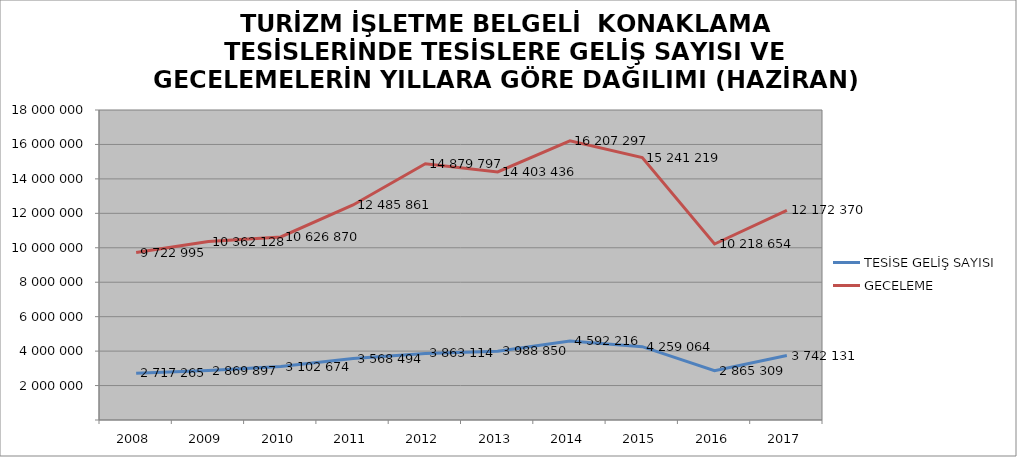
| Category | TESİSE GELİŞ SAYISI | GECELEME |
|---|---|---|
| 2008 | 2717265 | 9722995 |
| 2009 | 2869897 | 10362128 |
| 2010 | 3102674 | 10626870 |
| 2011 | 3568494 | 12485861 |
| 2012 | 3863114 | 14879797 |
| 2013 | 3988850 | 14403436 |
| 2014 | 4592216 | 16207297 |
| 2015 | 4259064 | 15241219 |
| 2016 | 2865309 | 10218654 |
| 2017 | 3742131 | 12172370 |